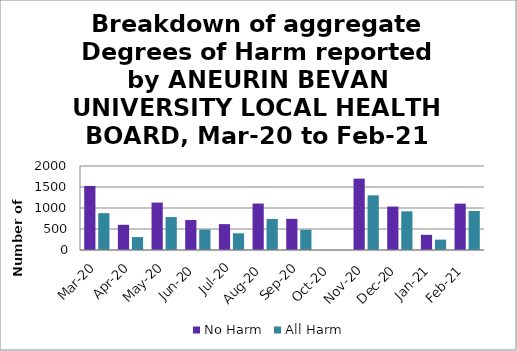
| Category | No Harm | All Harm |
|---|---|---|
| Mar-20 | 1525 | 877 |
| Apr-20 | 600 | 308 |
| May-20 | 1129 | 784 |
| Jun-20 | 715 | 487 |
| Jul-20 | 616 | 398 |
| Aug-20 | 1106 | 740 |
| Sep-20 | 742 | 482 |
| Oct-20 | 0 | 0 |
| Nov-20 | 1699 | 1302 |
| Dec-20 | 1034 | 921 |
| Jan-21 | 361 | 247 |
| Feb-21 | 1104 | 929 |